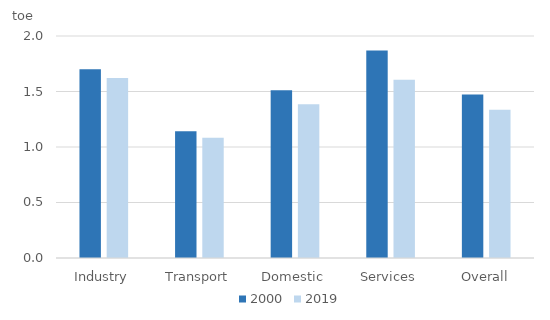
| Category | 2000 | 2019 |
|---|---|---|
| Industry | 1.701 | 1.621 |
| Transport | 1.141 | 1.083 |
| Domestic | 1.512 | 1.384 |
| Services | 1.87 | 1.606 |
| Overall | 1.473 | 1.335 |